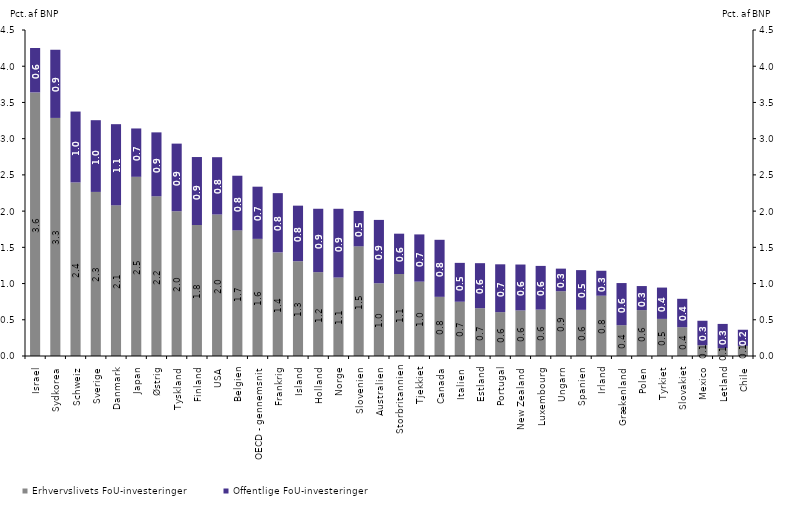
| Category | Erhvervslivets FoU-investeringer | Offentlige FoU-investeringer |
|---|---|---|
| Israel | 3.638 | 0.613 |
| Sydkorea | 3.286 | 0.941 |
| Schweiz | 2.395 | 0.979 |
| Sverige | 2.265 | 0.99 |
| Danmark | 2.08 | 1.12 |
| Japan | 2.473 | 0.667 |
| Østrig | 2.205 | 0.882 |
| Tyskland | 1.998 | 0.933 |
| Finland | 1.808 | 0.938 |
| USA | 1.953 | 0.791 |
| Belgien | 1.735 | 0.754 |
| OECD - gennemsnit | 1.617 | 0.72 |
| Frankrig | 1.43 | 0.818 |
| Island | 1.308 | 0.767 |
| Holland | 1.157 | 0.875 |
| Norge | 1.083 | 0.95 |
| Slovenien | 1.514 | 0.488 |
| Australien | 1.004 | 0.875 |
| Storbritannien | 1.132 | 0.557 |
| Tjekkiet | 1.026 | 0.652 |
| Canada | 0.817 | 0.788 |
| Italien  | 0.749 | 0.537 |
| Estland | 0.66 | 0.622 |
| Portugal | 0.606 | 0.66 |
| New Zealand | 0.629 | 0.634 |
| Luxembourg | 0.64 | 0.604 |
| Ungarn | 0.894 | 0.312 |
| Spanien | 0.637 | 0.548 |
| Irland | 0.832 | 0.345 |
| Grækenland | 0.425 | 0.582 |
| Polen | 0.634 | 0.331 |
| Tyrkiet | 0.512 | 0.433 |
| Slovakiet | 0.398 | 0.392 |
| Mexico | 0.149 | 0.338 |
| Letland | 0.108 | 0.335 |
| Chile | 0.14 | 0.223 |